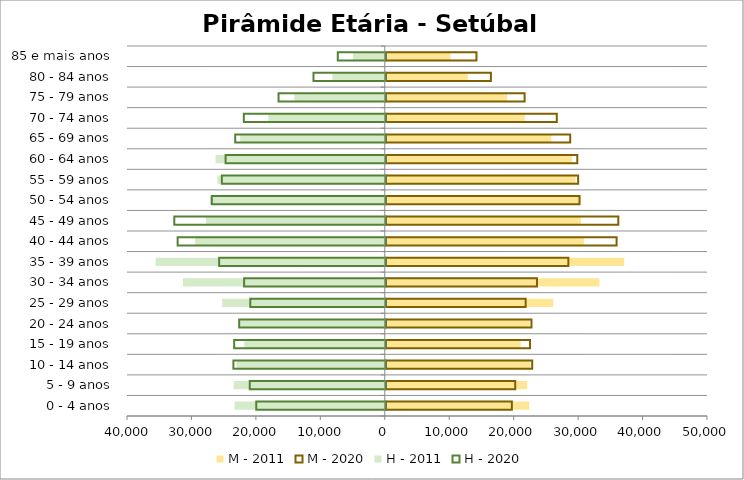
| Category | M - 2011 | M - 2020 | H - 2011 | H - 2020 |
|---|---|---|---|---|
| 0 - 4 anos | 22261 | 19562 | -23300 | -20098 |
| 5 - 9 anos | 21937 | 20089 | -23439 | -21108 |
| 10 - 14 anos | 22436 | 22721 | -23025 | -23644 |
| 15 - 19 anos | 20935 | 22382 | -21789 | -23525 |
| 20 - 24 anos | 22327 | 22609 | -22568 | -22748 |
| 25 - 29 anos | 25986 | 21705 | -25223 | -21025 |
| 30 - 34 anos | 33169 | 23461 | -31321 | -21984 |
| 35 - 39 anos | 37004 | 28331 | -35551 | -25859 |
| 40 - 44 anos | 30744 | 35815 | -29447 | -32297 |
| 45 - 49 anos | 30280 | 36082 | -27757 | -32819 |
| 50 - 54 anos | 30248 | 30061 | -27106 | -26997 |
| 55 - 59 anos | 29445 | 29849 | -25977 | -25435 |
| 60 - 64 anos | 28913 | 29716 | -26258 | -24856 |
| 65 - 69 anos | 25689 | 28617 | -22444 | -23365 |
| 70 - 74 anos | 21578 | 26537 | -18057 | -22024 |
| 75 - 79 anos | 18829 | 21541 | -14031 | -16638 |
| 80 - 84 anos | 12728 | 16310 | -8127 | -11218 |
| 85 e mais anos | 10043 | 14072 | -4914 | -7447 |